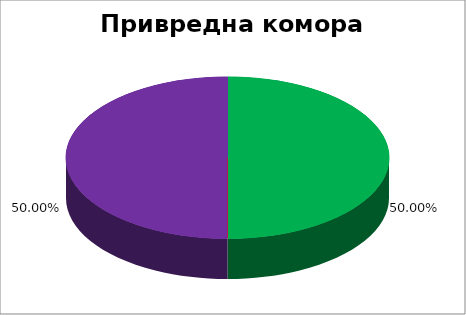
| Category | Привредна комора Србије  |
|---|---|
| 0 | 0.5 |
| 1 | 0 |
| 2 | 0 |
| 3 | 0 |
| 4 | 0.5 |